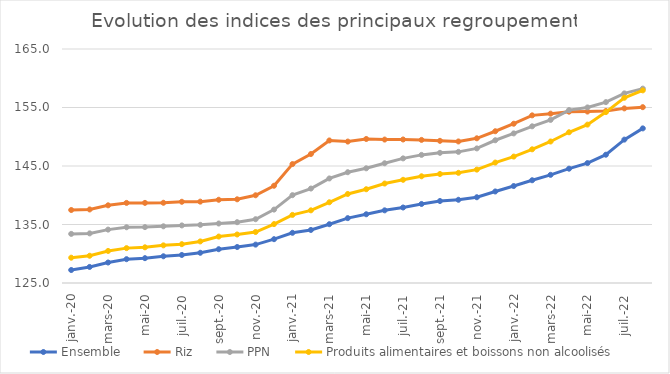
| Category | Ensemble | Riz | PPN | Produits alimentaires et boissons non alcoolisés |
|---|---|---|---|---|
| 2020-01-01 | 127.22 | 137.477 | 133.394 | 129.324 |
| 2020-02-01 | 127.747 | 137.571 | 133.482 | 129.658 |
| 2020-03-01 | 128.503 | 138.279 | 134.127 | 130.477 |
| 2020-04-01 | 129.073 | 138.691 | 134.528 | 130.962 |
| 2020-05-01 | 129.246 | 138.695 | 134.553 | 131.1 |
| 2020-06-01 | 129.569 | 138.715 | 134.691 | 131.433 |
| 2020-07-01 | 129.792 | 138.884 | 134.842 | 131.639 |
| 2020-08-01 | 130.165 | 138.908 | 134.939 | 132.108 |
| 2020-09-01 | 130.779 | 139.227 | 135.17 | 132.94 |
| 2020-10-01 | 131.152 | 139.307 | 135.396 | 133.293 |
| 2020-11-01 | 131.562 | 139.996 | 135.904 | 133.717 |
| 2020-12-01 | 132.488 | 141.627 | 137.548 | 135.07 |
| 2021-01-01 | 133.582 | 145.33 | 140.014 | 136.64 |
| 2021-02-01 | 134.068 | 147.047 | 141.147 | 137.422 |
| 2021-03-01 | 135.051 | 149.367 | 142.872 | 138.8 |
| 2021-04-01 | 136.088 | 149.178 | 143.938 | 140.217 |
| 2021-05-01 | 136.75 | 149.619 | 144.606 | 141.028 |
| 2021-06-01 | 137.421 | 149.519 | 145.469 | 142.002 |
| 2021-07-01 | 137.905 | 149.532 | 146.302 | 142.639 |
| 2021-08-01 | 138.51 | 149.461 | 146.899 | 143.242 |
| 2021-09-01 | 139.014 | 149.302 | 147.252 | 143.631 |
| 2021-10-01 | 139.227 | 149.196 | 147.416 | 143.832 |
| 2021-11-01 | 139.66 | 149.736 | 148.006 | 144.381 |
| 2021-12-01 | 140.647 | 150.942 | 149.401 | 145.589 |
| 2022-01-01 | 141.575 | 152.225 | 150.572 | 146.611 |
| 2022-02-01 | 142.565 | 153.658 | 151.785 | 147.854 |
| 2022-03-01 | 143.49 | 153.947 | 152.881 | 149.188 |
| 2022-04-01 | 144.542 | 154.286 | 154.56 | 150.765 |
| 2022-05-01 | 145.5 | 154.308 | 155.011 | 152.074 |
| 2022-06-01 | 146.929 | 154.397 | 155.916 | 154.212 |
| 2022-07-01 | 149.51 | 154.848 | 157.411 | 156.664 |
| 2022-08-01 | 151.429 | 155.056 | 158.224 | 157.93 |